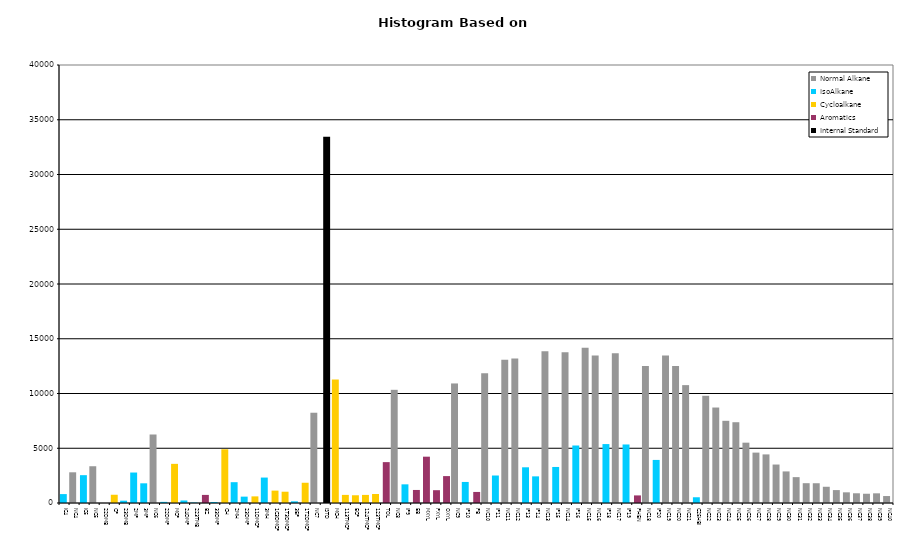
| Category | Normal Alkane | IsoAlkane | Cycloalkane | Aromatics | Internal Standard |
|---|---|---|---|---|---|
| IC4 | 0 | 814 | 0 | 0 | 0 |
| NC4 | 2804 | 0 | 0 | 0 | 0 |
| IC5 | 0 | 2542 | 0 | 0 | 0 |
| NC5 | 3357 | 0 | 0 | 0 | 0 |
| 22DMB | 0 | 0 | 0 | 0 | 0 |
| CP | 0 | 0 | 753 | 0 | 0 |
| 23DMB | 0 | 213 | 0 | 0 | 0 |
| 2MP | 0 | 2783 | 0 | 0 | 0 |
| 3MP | 0 | 1798 | 0 | 0 | 0 |
| NC6 | 6256 | 0 | 0 | 0 | 0 |
| 22DMP | 0 | 103 | 0 | 0 | 0 |
| MCP | 0 | 0 | 3575 | 0 | 0 |
| 24DMP | 0 | 231 | 0 | 0 | 0 |
| 223TMB | 0 | 43 | 0 | 0 | 0 |
| BZ | 0 | 0 | 0 | 739 | 0 |
| 33DMP | 0 | 90 | 0 | 0 | 0 |
| CH | 0 | 0 | 4906 | 0 | 0 |
| 2MH | 0 | 1901 | 0 | 0 | 0 |
| 23DMP | 0 | 581 | 0 | 0 | 0 |
| 11DMCP | 0 | 0 | 605 | 0 | 0 |
| 3MH | 0 | 2323 | 0 | 0 | 0 |
| 1C3DMCP | 0 | 0 | 1131 | 0 | 0 |
| 1T3DMCP | 0 | 0 | 1031 | 0 | 0 |
| 3EP | 0 | 153 | 0 | 0 | 0 |
| 1T2DMCP | 0 | 0 | 1849 | 0 | 0 |
| NC7 | 8243 | 0 | 0 | 0 | 0 |
| ISTD | 0 | 0 | 0 | 0 | 33441 |
| MCH | 0 | 0 | 11277 | 0 | 0 |
| 113TMCP | 0 | 0 | 740 | 0 | 0 |
| ECP | 0 | 0 | 707 | 0 | 0 |
| 124TMCP | 0 | 0 | 739 | 0 | 0 |
| 123TMCP | 0 | 0 | 823 | 0 | 0 |
| TOL | 0 | 0 | 0 | 3733 | 0 |
| NC8 | 10336 | 0 | 0 | 0 | 0 |
| IP9 | 0 | 1705 | 0 | 0 | 0 |
| EB | 0 | 0 | 0 | 1191 | 0 |
| MXYL | 0 | 0 | 0 | 4230 | 0 |
| PXYL | 0 | 0 | 0 | 1170 | 0 |
| OXYL | 0 | 0 | 0 | 2457 | 0 |
| NC9 | 10918 | 0 | 0 | 0 | 0 |
| IP10 | 0 | 1922 | 0 | 0 | 0 |
| PB | 0 | 0 | 0 | 1009 | 0 |
| NC10 | 11849 | 0 | 0 | 0 | 0 |
| IP11 | 0 | 2511 | 0 | 0 | 0 |
| NC11 | 13078 | 0 | 0 | 0 | 0 |
| NC12 | 13189 | 0 | 0 | 0 | 0 |
| IP13 | 0 | 3261 | 0 | 0 | 0 |
| IP14 | 0 | 2433 | 0 | 0 | 0 |
| NC13 | 13864 | 0 | 0 | 0 | 0 |
| IP15 | 0 | 3291 | 0 | 0 | 0 |
| NC14 | 13771 | 0 | 0 | 0 | 0 |
| IP16 | 0 | 5251 | 0 | 0 | 0 |
| NC15 | 14172 | 0 | 0 | 0 | 0 |
| NC16 | 13465 | 0 | 0 | 0 | 0 |
| IP18 | 0 | 5381 | 0 | 0 | 0 |
| NC17 | 13684 | 0 | 0 | 0 | 0 |
| IP19 | 0 | 5345 | 0 | 0 | 0 |
| PHEN | 0 | 0 | 0 | 693 | 0 |
| NC18 | 12517 | 0 | 0 | 0 | 0 |
| IP20 | 0 | 3934 | 0 | 0 | 0 |
| NC19 | 13464 | 0 | 0 | 0 | 0 |
| NC20 | 12503 | 0 | 0 | 0 | 0 |
| NC21 | 10765 | 0 | 0 | 0 | 0 |
| C25HBI | 0 | 524 | 0 | 0 | 0 |
| NC22 | 9791 | 0 | 0 | 0 | 0 |
| NC23 | 8719 | 0 | 0 | 0 | 0 |
| NC24 | 7506 | 0 | 0 | 0 | 0 |
| NC25 | 7377 | 0 | 0 | 0 | 0 |
| NC26 | 5510 | 0 | 0 | 0 | 0 |
| NC27 | 4602 | 0 | 0 | 0 | 0 |
| NC28 | 4438 | 0 | 0 | 0 | 0 |
| NC29 | 3513 | 0 | 0 | 0 | 0 |
| NC30 | 2884 | 0 | 0 | 0 | 0 |
| NC31 | 2362 | 0 | 0 | 0 | 0 |
| NC32 | 1809 | 0 | 0 | 0 | 0 |
| NC33 | 1805 | 0 | 0 | 0 | 0 |
| NC34 | 1483 | 0 | 0 | 0 | 0 |
| NC35 | 1180 | 0 | 0 | 0 | 0 |
| NC36 | 975 | 0 | 0 | 0 | 0 |
| NC37 | 888 | 0 | 0 | 0 | 0 |
| NC38 | 845 | 0 | 0 | 0 | 0 |
| NC39 | 884 | 0 | 0 | 0 | 0 |
| NC40 | 636 | 0 | 0 | 0 | 0 |